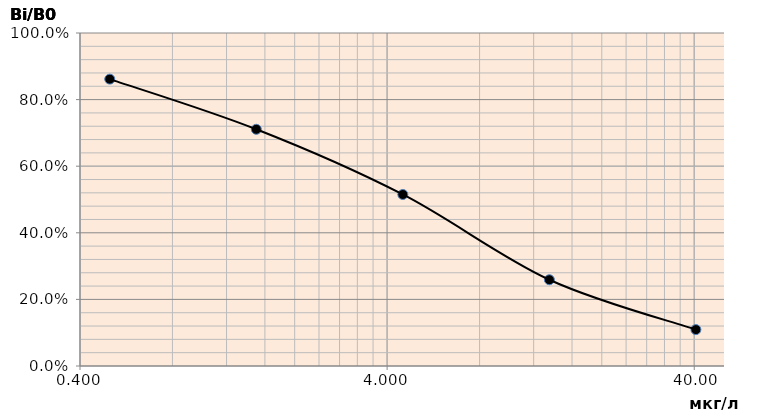
| Category | Series 0 |
|---|---|
| 0.5 | 0.861 |
| 1.5 | 0.711 |
| 4.5 | 0.515 |
| 13.5 | 0.259 |
| 40.5 | 0.109 |